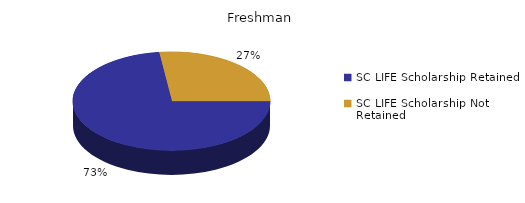
| Category | Freshman |
|---|---|
| SC LIFE Scholarship Retained  | 1334 |
| SC LIFE Scholarship Not Retained  | 495 |